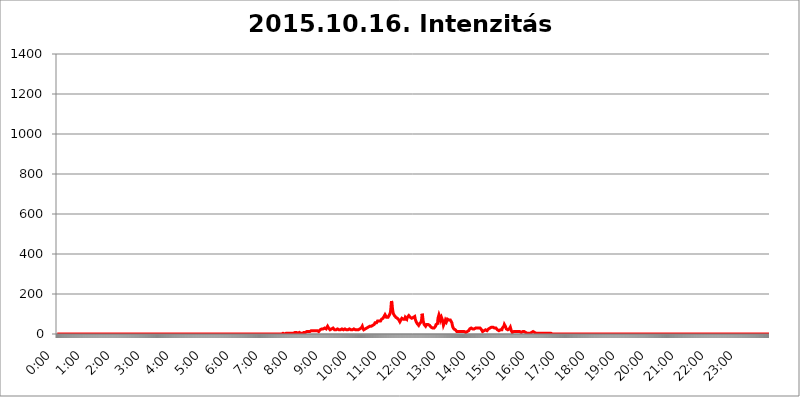
| Category | 2015.10.16. Intenzitás [W/m^2] |
|---|---|
| 0.0 | 0 |
| 0.0006944444444444445 | 0 |
| 0.001388888888888889 | 0 |
| 0.0020833333333333333 | 0 |
| 0.002777777777777778 | 0 |
| 0.003472222222222222 | 0 |
| 0.004166666666666667 | 0 |
| 0.004861111111111111 | 0 |
| 0.005555555555555556 | 0 |
| 0.0062499999999999995 | 0 |
| 0.006944444444444444 | 0 |
| 0.007638888888888889 | 0 |
| 0.008333333333333333 | 0 |
| 0.009027777777777779 | 0 |
| 0.009722222222222222 | 0 |
| 0.010416666666666666 | 0 |
| 0.011111111111111112 | 0 |
| 0.011805555555555555 | 0 |
| 0.012499999999999999 | 0 |
| 0.013194444444444444 | 0 |
| 0.013888888888888888 | 0 |
| 0.014583333333333332 | 0 |
| 0.015277777777777777 | 0 |
| 0.015972222222222224 | 0 |
| 0.016666666666666666 | 0 |
| 0.017361111111111112 | 0 |
| 0.018055555555555557 | 0 |
| 0.01875 | 0 |
| 0.019444444444444445 | 0 |
| 0.02013888888888889 | 0 |
| 0.020833333333333332 | 0 |
| 0.02152777777777778 | 0 |
| 0.022222222222222223 | 0 |
| 0.02291666666666667 | 0 |
| 0.02361111111111111 | 0 |
| 0.024305555555555556 | 0 |
| 0.024999999999999998 | 0 |
| 0.025694444444444447 | 0 |
| 0.02638888888888889 | 0 |
| 0.027083333333333334 | 0 |
| 0.027777777777777776 | 0 |
| 0.02847222222222222 | 0 |
| 0.029166666666666664 | 0 |
| 0.029861111111111113 | 0 |
| 0.030555555555555555 | 0 |
| 0.03125 | 0 |
| 0.03194444444444445 | 0 |
| 0.03263888888888889 | 0 |
| 0.03333333333333333 | 0 |
| 0.034027777777777775 | 0 |
| 0.034722222222222224 | 0 |
| 0.035416666666666666 | 0 |
| 0.036111111111111115 | 0 |
| 0.03680555555555556 | 0 |
| 0.0375 | 0 |
| 0.03819444444444444 | 0 |
| 0.03888888888888889 | 0 |
| 0.03958333333333333 | 0 |
| 0.04027777777777778 | 0 |
| 0.04097222222222222 | 0 |
| 0.041666666666666664 | 0 |
| 0.042361111111111106 | 0 |
| 0.04305555555555556 | 0 |
| 0.043750000000000004 | 0 |
| 0.044444444444444446 | 0 |
| 0.04513888888888889 | 0 |
| 0.04583333333333334 | 0 |
| 0.04652777777777778 | 0 |
| 0.04722222222222222 | 0 |
| 0.04791666666666666 | 0 |
| 0.04861111111111111 | 0 |
| 0.049305555555555554 | 0 |
| 0.049999999999999996 | 0 |
| 0.05069444444444445 | 0 |
| 0.051388888888888894 | 0 |
| 0.052083333333333336 | 0 |
| 0.05277777777777778 | 0 |
| 0.05347222222222222 | 0 |
| 0.05416666666666667 | 0 |
| 0.05486111111111111 | 0 |
| 0.05555555555555555 | 0 |
| 0.05625 | 0 |
| 0.05694444444444444 | 0 |
| 0.057638888888888885 | 0 |
| 0.05833333333333333 | 0 |
| 0.05902777777777778 | 0 |
| 0.059722222222222225 | 0 |
| 0.06041666666666667 | 0 |
| 0.061111111111111116 | 0 |
| 0.06180555555555556 | 0 |
| 0.0625 | 0 |
| 0.06319444444444444 | 0 |
| 0.06388888888888888 | 0 |
| 0.06458333333333334 | 0 |
| 0.06527777777777778 | 0 |
| 0.06597222222222222 | 0 |
| 0.06666666666666667 | 0 |
| 0.06736111111111111 | 0 |
| 0.06805555555555555 | 0 |
| 0.06874999999999999 | 0 |
| 0.06944444444444443 | 0 |
| 0.07013888888888889 | 0 |
| 0.07083333333333333 | 0 |
| 0.07152777777777779 | 0 |
| 0.07222222222222223 | 0 |
| 0.07291666666666667 | 0 |
| 0.07361111111111111 | 0 |
| 0.07430555555555556 | 0 |
| 0.075 | 0 |
| 0.07569444444444444 | 0 |
| 0.0763888888888889 | 0 |
| 0.07708333333333334 | 0 |
| 0.07777777777777778 | 0 |
| 0.07847222222222222 | 0 |
| 0.07916666666666666 | 0 |
| 0.0798611111111111 | 0 |
| 0.08055555555555556 | 0 |
| 0.08125 | 0 |
| 0.08194444444444444 | 0 |
| 0.08263888888888889 | 0 |
| 0.08333333333333333 | 0 |
| 0.08402777777777777 | 0 |
| 0.08472222222222221 | 0 |
| 0.08541666666666665 | 0 |
| 0.08611111111111112 | 0 |
| 0.08680555555555557 | 0 |
| 0.08750000000000001 | 0 |
| 0.08819444444444445 | 0 |
| 0.08888888888888889 | 0 |
| 0.08958333333333333 | 0 |
| 0.09027777777777778 | 0 |
| 0.09097222222222222 | 0 |
| 0.09166666666666667 | 0 |
| 0.09236111111111112 | 0 |
| 0.09305555555555556 | 0 |
| 0.09375 | 0 |
| 0.09444444444444444 | 0 |
| 0.09513888888888888 | 0 |
| 0.09583333333333333 | 0 |
| 0.09652777777777777 | 0 |
| 0.09722222222222222 | 0 |
| 0.09791666666666667 | 0 |
| 0.09861111111111111 | 0 |
| 0.09930555555555555 | 0 |
| 0.09999999999999999 | 0 |
| 0.10069444444444443 | 0 |
| 0.1013888888888889 | 0 |
| 0.10208333333333335 | 0 |
| 0.10277777777777779 | 0 |
| 0.10347222222222223 | 0 |
| 0.10416666666666667 | 0 |
| 0.10486111111111111 | 0 |
| 0.10555555555555556 | 0 |
| 0.10625 | 0 |
| 0.10694444444444444 | 0 |
| 0.1076388888888889 | 0 |
| 0.10833333333333334 | 0 |
| 0.10902777777777778 | 0 |
| 0.10972222222222222 | 0 |
| 0.1111111111111111 | 0 |
| 0.11180555555555556 | 0 |
| 0.11180555555555556 | 0 |
| 0.1125 | 0 |
| 0.11319444444444444 | 0 |
| 0.11388888888888889 | 0 |
| 0.11458333333333333 | 0 |
| 0.11527777777777777 | 0 |
| 0.11597222222222221 | 0 |
| 0.11666666666666665 | 0 |
| 0.1173611111111111 | 0 |
| 0.11805555555555557 | 0 |
| 0.11944444444444445 | 0 |
| 0.12013888888888889 | 0 |
| 0.12083333333333333 | 0 |
| 0.12152777777777778 | 0 |
| 0.12222222222222223 | 0 |
| 0.12291666666666667 | 0 |
| 0.12291666666666667 | 0 |
| 0.12361111111111112 | 0 |
| 0.12430555555555556 | 0 |
| 0.125 | 0 |
| 0.12569444444444444 | 0 |
| 0.12638888888888888 | 0 |
| 0.12708333333333333 | 0 |
| 0.16875 | 0 |
| 0.12847222222222224 | 0 |
| 0.12916666666666668 | 0 |
| 0.12986111111111112 | 0 |
| 0.13055555555555556 | 0 |
| 0.13125 | 0 |
| 0.13194444444444445 | 0 |
| 0.1326388888888889 | 0 |
| 0.13333333333333333 | 0 |
| 0.13402777777777777 | 0 |
| 0.13402777777777777 | 0 |
| 0.13472222222222222 | 0 |
| 0.13541666666666666 | 0 |
| 0.1361111111111111 | 0 |
| 0.13749999999999998 | 0 |
| 0.13819444444444443 | 0 |
| 0.1388888888888889 | 0 |
| 0.13958333333333334 | 0 |
| 0.14027777777777778 | 0 |
| 0.14097222222222222 | 0 |
| 0.14166666666666666 | 0 |
| 0.1423611111111111 | 0 |
| 0.14305555555555557 | 0 |
| 0.14375000000000002 | 0 |
| 0.14444444444444446 | 0 |
| 0.1451388888888889 | 0 |
| 0.1451388888888889 | 0 |
| 0.14652777777777778 | 0 |
| 0.14722222222222223 | 0 |
| 0.14791666666666667 | 0 |
| 0.1486111111111111 | 0 |
| 0.14930555555555555 | 0 |
| 0.15 | 0 |
| 0.15069444444444444 | 0 |
| 0.15138888888888888 | 0 |
| 0.15208333333333332 | 0 |
| 0.15277777777777776 | 0 |
| 0.15347222222222223 | 0 |
| 0.15416666666666667 | 0 |
| 0.15486111111111112 | 0 |
| 0.15555555555555556 | 0 |
| 0.15625 | 0 |
| 0.15694444444444444 | 0 |
| 0.15763888888888888 | 0 |
| 0.15833333333333333 | 0 |
| 0.15902777777777777 | 0 |
| 0.15972222222222224 | 0 |
| 0.16041666666666668 | 0 |
| 0.16111111111111112 | 0 |
| 0.16180555555555556 | 0 |
| 0.1625 | 0 |
| 0.16319444444444445 | 0 |
| 0.1638888888888889 | 0 |
| 0.16458333333333333 | 0 |
| 0.16527777777777777 | 0 |
| 0.16597222222222222 | 0 |
| 0.16666666666666666 | 0 |
| 0.1673611111111111 | 0 |
| 0.16805555555555554 | 0 |
| 0.16874999999999998 | 0 |
| 0.16944444444444443 | 0 |
| 0.17013888888888887 | 0 |
| 0.1708333333333333 | 0 |
| 0.17152777777777775 | 0 |
| 0.17222222222222225 | 0 |
| 0.1729166666666667 | 0 |
| 0.17361111111111113 | 0 |
| 0.17430555555555557 | 0 |
| 0.17500000000000002 | 0 |
| 0.17569444444444446 | 0 |
| 0.1763888888888889 | 0 |
| 0.17708333333333334 | 0 |
| 0.17777777777777778 | 0 |
| 0.17847222222222223 | 0 |
| 0.17916666666666667 | 0 |
| 0.1798611111111111 | 0 |
| 0.18055555555555555 | 0 |
| 0.18125 | 0 |
| 0.18194444444444444 | 0 |
| 0.1826388888888889 | 0 |
| 0.18333333333333335 | 0 |
| 0.1840277777777778 | 0 |
| 0.18472222222222223 | 0 |
| 0.18541666666666667 | 0 |
| 0.18611111111111112 | 0 |
| 0.18680555555555556 | 0 |
| 0.1875 | 0 |
| 0.18819444444444444 | 0 |
| 0.18888888888888888 | 0 |
| 0.18958333333333333 | 0 |
| 0.19027777777777777 | 0 |
| 0.1909722222222222 | 0 |
| 0.19166666666666665 | 0 |
| 0.19236111111111112 | 0 |
| 0.19305555555555554 | 0 |
| 0.19375 | 0 |
| 0.19444444444444445 | 0 |
| 0.1951388888888889 | 0 |
| 0.19583333333333333 | 0 |
| 0.19652777777777777 | 0 |
| 0.19722222222222222 | 0 |
| 0.19791666666666666 | 0 |
| 0.1986111111111111 | 0 |
| 0.19930555555555554 | 0 |
| 0.19999999999999998 | 0 |
| 0.20069444444444443 | 0 |
| 0.20138888888888887 | 0 |
| 0.2020833333333333 | 0 |
| 0.2027777777777778 | 0 |
| 0.2034722222222222 | 0 |
| 0.2041666666666667 | 0 |
| 0.20486111111111113 | 0 |
| 0.20555555555555557 | 0 |
| 0.20625000000000002 | 0 |
| 0.20694444444444446 | 0 |
| 0.2076388888888889 | 0 |
| 0.20833333333333334 | 0 |
| 0.20902777777777778 | 0 |
| 0.20972222222222223 | 0 |
| 0.21041666666666667 | 0 |
| 0.2111111111111111 | 0 |
| 0.21180555555555555 | 0 |
| 0.2125 | 0 |
| 0.21319444444444444 | 0 |
| 0.2138888888888889 | 0 |
| 0.21458333333333335 | 0 |
| 0.2152777777777778 | 0 |
| 0.21597222222222223 | 0 |
| 0.21666666666666667 | 0 |
| 0.21736111111111112 | 0 |
| 0.21805555555555556 | 0 |
| 0.21875 | 0 |
| 0.21944444444444444 | 0 |
| 0.22013888888888888 | 0 |
| 0.22083333333333333 | 0 |
| 0.22152777777777777 | 0 |
| 0.2222222222222222 | 0 |
| 0.22291666666666665 | 0 |
| 0.2236111111111111 | 0 |
| 0.22430555555555556 | 0 |
| 0.225 | 0 |
| 0.22569444444444445 | 0 |
| 0.2263888888888889 | 0 |
| 0.22708333333333333 | 0 |
| 0.22777777777777777 | 0 |
| 0.22847222222222222 | 0 |
| 0.22916666666666666 | 0 |
| 0.2298611111111111 | 0 |
| 0.23055555555555554 | 0 |
| 0.23124999999999998 | 0 |
| 0.23194444444444443 | 0 |
| 0.23263888888888887 | 0 |
| 0.2333333333333333 | 0 |
| 0.2340277777777778 | 0 |
| 0.2347222222222222 | 0 |
| 0.2354166666666667 | 0 |
| 0.23611111111111113 | 0 |
| 0.23680555555555557 | 0 |
| 0.23750000000000002 | 0 |
| 0.23819444444444446 | 0 |
| 0.2388888888888889 | 0 |
| 0.23958333333333334 | 0 |
| 0.24027777777777778 | 0 |
| 0.24097222222222223 | 0 |
| 0.24166666666666667 | 0 |
| 0.2423611111111111 | 0 |
| 0.24305555555555555 | 0 |
| 0.24375 | 0 |
| 0.24444444444444446 | 0 |
| 0.24513888888888888 | 0 |
| 0.24583333333333335 | 0 |
| 0.2465277777777778 | 0 |
| 0.24722222222222223 | 0 |
| 0.24791666666666667 | 0 |
| 0.24861111111111112 | 0 |
| 0.24930555555555556 | 0 |
| 0.25 | 0 |
| 0.25069444444444444 | 0 |
| 0.2513888888888889 | 0 |
| 0.2520833333333333 | 0 |
| 0.25277777777777777 | 0 |
| 0.2534722222222222 | 0 |
| 0.25416666666666665 | 0 |
| 0.2548611111111111 | 0 |
| 0.2555555555555556 | 0 |
| 0.25625000000000003 | 0 |
| 0.2569444444444445 | 0 |
| 0.2576388888888889 | 0 |
| 0.25833333333333336 | 0 |
| 0.2590277777777778 | 0 |
| 0.25972222222222224 | 0 |
| 0.2604166666666667 | 0 |
| 0.2611111111111111 | 0 |
| 0.26180555555555557 | 0 |
| 0.2625 | 0 |
| 0.26319444444444445 | 0 |
| 0.2638888888888889 | 0 |
| 0.26458333333333334 | 0 |
| 0.2652777777777778 | 0 |
| 0.2659722222222222 | 0 |
| 0.26666666666666666 | 0 |
| 0.2673611111111111 | 0 |
| 0.26805555555555555 | 0 |
| 0.26875 | 0 |
| 0.26944444444444443 | 0 |
| 0.2701388888888889 | 0 |
| 0.2708333333333333 | 0 |
| 0.27152777777777776 | 0 |
| 0.2722222222222222 | 0 |
| 0.27291666666666664 | 0 |
| 0.2736111111111111 | 0 |
| 0.2743055555555555 | 0 |
| 0.27499999999999997 | 0 |
| 0.27569444444444446 | 0 |
| 0.27638888888888885 | 0 |
| 0.27708333333333335 | 0 |
| 0.2777777777777778 | 0 |
| 0.27847222222222223 | 0 |
| 0.2791666666666667 | 0 |
| 0.2798611111111111 | 0 |
| 0.28055555555555556 | 0 |
| 0.28125 | 0 |
| 0.28194444444444444 | 0 |
| 0.2826388888888889 | 0 |
| 0.2833333333333333 | 0 |
| 0.28402777777777777 | 0 |
| 0.2847222222222222 | 0 |
| 0.28541666666666665 | 0 |
| 0.28611111111111115 | 0 |
| 0.28680555555555554 | 0 |
| 0.28750000000000003 | 0 |
| 0.2881944444444445 | 0 |
| 0.2888888888888889 | 0 |
| 0.28958333333333336 | 0 |
| 0.2902777777777778 | 0 |
| 0.29097222222222224 | 0 |
| 0.2916666666666667 | 0 |
| 0.2923611111111111 | 0 |
| 0.29305555555555557 | 0 |
| 0.29375 | 0 |
| 0.29444444444444445 | 0 |
| 0.2951388888888889 | 0 |
| 0.29583333333333334 | 0 |
| 0.2965277777777778 | 0 |
| 0.2972222222222222 | 0 |
| 0.29791666666666666 | 0 |
| 0.2986111111111111 | 0 |
| 0.29930555555555555 | 0 |
| 0.3 | 0 |
| 0.30069444444444443 | 0 |
| 0.3013888888888889 | 0 |
| 0.3020833333333333 | 0 |
| 0.30277777777777776 | 0 |
| 0.3034722222222222 | 0 |
| 0.30416666666666664 | 0 |
| 0.3048611111111111 | 0 |
| 0.3055555555555555 | 0 |
| 0.30624999999999997 | 0 |
| 0.3069444444444444 | 0 |
| 0.3076388888888889 | 0 |
| 0.30833333333333335 | 0 |
| 0.3090277777777778 | 0 |
| 0.30972222222222223 | 0 |
| 0.3104166666666667 | 0 |
| 0.3111111111111111 | 0 |
| 0.31180555555555556 | 0 |
| 0.3125 | 0 |
| 0.31319444444444444 | 0 |
| 0.3138888888888889 | 0 |
| 0.3145833333333333 | 0 |
| 0.31527777777777777 | 0 |
| 0.3159722222222222 | 3.525 |
| 0.31666666666666665 | 3.525 |
| 0.31736111111111115 | 0 |
| 0.31805555555555554 | 3.525 |
| 0.31875000000000003 | 0 |
| 0.3194444444444445 | 3.525 |
| 0.3201388888888889 | 3.525 |
| 0.32083333333333336 | 3.525 |
| 0.3215277777777778 | 0 |
| 0.32222222222222224 | 3.525 |
| 0.3229166666666667 | 3.525 |
| 0.3236111111111111 | 3.525 |
| 0.32430555555555557 | 3.525 |
| 0.325 | 3.525 |
| 0.32569444444444445 | 3.525 |
| 0.3263888888888889 | 3.525 |
| 0.32708333333333334 | 3.525 |
| 0.3277777777777778 | 3.525 |
| 0.3284722222222222 | 3.525 |
| 0.32916666666666666 | 3.525 |
| 0.3298611111111111 | 3.525 |
| 0.33055555555555555 | 3.525 |
| 0.33125 | 3.525 |
| 0.33194444444444443 | 3.525 |
| 0.3326388888888889 | 3.525 |
| 0.3333333333333333 | 7.887 |
| 0.3340277777777778 | 7.887 |
| 0.3347222222222222 | 7.887 |
| 0.3354166666666667 | 7.887 |
| 0.3361111111111111 | 3.525 |
| 0.3368055555555556 | 3.525 |
| 0.33749999999999997 | 3.525 |
| 0.33819444444444446 | 3.525 |
| 0.33888888888888885 | 3.525 |
| 0.33958333333333335 | 7.887 |
| 0.34027777777777773 | 7.887 |
| 0.34097222222222223 | 3.525 |
| 0.3416666666666666 | 3.525 |
| 0.3423611111111111 | 3.525 |
| 0.3430555555555555 | 3.525 |
| 0.34375 | 3.525 |
| 0.3444444444444445 | 3.525 |
| 0.3451388888888889 | 7.887 |
| 0.3458333333333334 | 7.887 |
| 0.34652777777777777 | 7.887 |
| 0.34722222222222227 | 7.887 |
| 0.34791666666666665 | 7.887 |
| 0.34861111111111115 | 7.887 |
| 0.34930555555555554 | 7.887 |
| 0.35000000000000003 | 12.257 |
| 0.3506944444444444 | 12.257 |
| 0.3513888888888889 | 12.257 |
| 0.3520833333333333 | 12.257 |
| 0.3527777777777778 | 16.636 |
| 0.3534722222222222 | 16.636 |
| 0.3541666666666667 | 12.257 |
| 0.3548611111111111 | 12.257 |
| 0.35555555555555557 | 16.636 |
| 0.35625 | 16.636 |
| 0.35694444444444445 | 16.636 |
| 0.3576388888888889 | 16.636 |
| 0.35833333333333334 | 16.636 |
| 0.3590277777777778 | 16.636 |
| 0.3597222222222222 | 16.636 |
| 0.36041666666666666 | 16.636 |
| 0.3611111111111111 | 16.636 |
| 0.36180555555555555 | 16.636 |
| 0.3625 | 16.636 |
| 0.36319444444444443 | 16.636 |
| 0.3638888888888889 | 16.636 |
| 0.3645833333333333 | 16.636 |
| 0.3652777777777778 | 12.257 |
| 0.3659722222222222 | 12.257 |
| 0.3666666666666667 | 12.257 |
| 0.3673611111111111 | 12.257 |
| 0.3680555555555556 | 12.257 |
| 0.36874999999999997 | 21.024 |
| 0.36944444444444446 | 21.024 |
| 0.37013888888888885 | 25.419 |
| 0.37083333333333335 | 25.419 |
| 0.37152777777777773 | 25.419 |
| 0.37222222222222223 | 25.419 |
| 0.3729166666666666 | 25.419 |
| 0.3736111111111111 | 29.823 |
| 0.3743055555555555 | 29.823 |
| 0.375 | 29.823 |
| 0.3756944444444445 | 29.823 |
| 0.3763888888888889 | 25.419 |
| 0.3770833333333334 | 25.419 |
| 0.37777777777777777 | 25.419 |
| 0.37847222222222227 | 29.823 |
| 0.37916666666666665 | 38.653 |
| 0.37986111111111115 | 34.234 |
| 0.38055555555555554 | 29.823 |
| 0.38125000000000003 | 25.419 |
| 0.3819444444444444 | 25.419 |
| 0.3826388888888889 | 21.024 |
| 0.3833333333333333 | 21.024 |
| 0.3840277777777778 | 21.024 |
| 0.3847222222222222 | 25.419 |
| 0.3854166666666667 | 29.823 |
| 0.3861111111111111 | 29.823 |
| 0.38680555555555557 | 29.823 |
| 0.3875 | 29.823 |
| 0.38819444444444445 | 25.419 |
| 0.3888888888888889 | 21.024 |
| 0.38958333333333334 | 21.024 |
| 0.3902777777777778 | 21.024 |
| 0.3909722222222222 | 21.024 |
| 0.39166666666666666 | 21.024 |
| 0.3923611111111111 | 21.024 |
| 0.39305555555555555 | 25.419 |
| 0.39375 | 25.419 |
| 0.39444444444444443 | 25.419 |
| 0.3951388888888889 | 21.024 |
| 0.3958333333333333 | 21.024 |
| 0.3965277777777778 | 21.024 |
| 0.3972222222222222 | 21.024 |
| 0.3979166666666667 | 21.024 |
| 0.3986111111111111 | 25.419 |
| 0.3993055555555556 | 25.419 |
| 0.39999999999999997 | 21.024 |
| 0.40069444444444446 | 21.024 |
| 0.40138888888888885 | 21.024 |
| 0.40208333333333335 | 21.024 |
| 0.40277777777777773 | 21.024 |
| 0.40347222222222223 | 25.419 |
| 0.4041666666666666 | 21.024 |
| 0.4048611111111111 | 21.024 |
| 0.4055555555555555 | 21.024 |
| 0.40625 | 21.024 |
| 0.4069444444444445 | 21.024 |
| 0.4076388888888889 | 21.024 |
| 0.4083333333333334 | 25.419 |
| 0.40902777777777777 | 25.419 |
| 0.40972222222222227 | 25.419 |
| 0.41041666666666665 | 25.419 |
| 0.41111111111111115 | 21.024 |
| 0.41180555555555554 | 21.024 |
| 0.41250000000000003 | 21.024 |
| 0.4131944444444444 | 21.024 |
| 0.4138888888888889 | 21.024 |
| 0.4145833333333333 | 21.024 |
| 0.4152777777777778 | 25.419 |
| 0.4159722222222222 | 25.419 |
| 0.4166666666666667 | 25.419 |
| 0.4173611111111111 | 21.024 |
| 0.41805555555555557 | 21.024 |
| 0.41875 | 21.024 |
| 0.41944444444444445 | 21.024 |
| 0.4201388888888889 | 21.024 |
| 0.42083333333333334 | 21.024 |
| 0.4215277777777778 | 21.024 |
| 0.4222222222222222 | 21.024 |
| 0.42291666666666666 | 21.024 |
| 0.4236111111111111 | 25.419 |
| 0.42430555555555555 | 25.419 |
| 0.425 | 25.419 |
| 0.42569444444444443 | 25.419 |
| 0.4263888888888889 | 29.823 |
| 0.4270833333333333 | 34.234 |
| 0.4277777777777778 | 38.653 |
| 0.4284722222222222 | 29.823 |
| 0.4291666666666667 | 25.419 |
| 0.4298611111111111 | 21.024 |
| 0.4305555555555556 | 21.024 |
| 0.43124999999999997 | 25.419 |
| 0.43194444444444446 | 25.419 |
| 0.43263888888888885 | 29.823 |
| 0.43333333333333335 | 29.823 |
| 0.43402777777777773 | 29.823 |
| 0.43472222222222223 | 29.823 |
| 0.4354166666666666 | 34.234 |
| 0.4361111111111111 | 34.234 |
| 0.4368055555555555 | 38.653 |
| 0.4375 | 38.653 |
| 0.4381944444444445 | 38.653 |
| 0.4388888888888889 | 38.653 |
| 0.4395833333333334 | 38.653 |
| 0.44027777777777777 | 38.653 |
| 0.44097222222222227 | 43.079 |
| 0.44166666666666665 | 43.079 |
| 0.44236111111111115 | 43.079 |
| 0.44305555555555554 | 43.079 |
| 0.44375000000000003 | 47.511 |
| 0.4444444444444444 | 47.511 |
| 0.4451388888888889 | 51.951 |
| 0.4458333333333333 | 56.398 |
| 0.4465277777777778 | 51.951 |
| 0.4472222222222222 | 56.398 |
| 0.4479166666666667 | 56.398 |
| 0.4486111111111111 | 60.85 |
| 0.44930555555555557 | 65.31 |
| 0.45 | 65.31 |
| 0.45069444444444445 | 65.31 |
| 0.4513888888888889 | 65.31 |
| 0.45208333333333334 | 65.31 |
| 0.4527777777777778 | 69.775 |
| 0.4534722222222222 | 65.31 |
| 0.45416666666666666 | 69.775 |
| 0.4548611111111111 | 74.246 |
| 0.45555555555555555 | 69.775 |
| 0.45625 | 74.246 |
| 0.45694444444444443 | 78.722 |
| 0.4576388888888889 | 83.205 |
| 0.4583333333333333 | 87.692 |
| 0.4590277777777778 | 92.184 |
| 0.4597222222222222 | 96.682 |
| 0.4604166666666667 | 96.682 |
| 0.4611111111111111 | 92.184 |
| 0.4618055555555556 | 83.205 |
| 0.46249999999999997 | 83.205 |
| 0.46319444444444446 | 78.722 |
| 0.46388888888888885 | 83.205 |
| 0.46458333333333335 | 87.692 |
| 0.46527777777777773 | 92.184 |
| 0.46597222222222223 | 96.682 |
| 0.4666666666666666 | 101.184 |
| 0.4673611111111111 | 110.201 |
| 0.4680555555555555 | 132.814 |
| 0.46875 | 164.605 |
| 0.4694444444444445 | 155.509 |
| 0.4701388888888889 | 128.284 |
| 0.4708333333333334 | 110.201 |
| 0.47152777777777777 | 101.184 |
| 0.47222222222222227 | 96.682 |
| 0.47291666666666665 | 92.184 |
| 0.47361111111111115 | 87.692 |
| 0.47430555555555554 | 92.184 |
| 0.47500000000000003 | 83.205 |
| 0.4756944444444444 | 78.722 |
| 0.4763888888888889 | 78.722 |
| 0.4770833333333333 | 78.722 |
| 0.4777777777777778 | 78.722 |
| 0.4784722222222222 | 74.246 |
| 0.4791666666666667 | 69.775 |
| 0.4798611111111111 | 65.31 |
| 0.48055555555555557 | 60.85 |
| 0.48125 | 60.85 |
| 0.48194444444444445 | 69.775 |
| 0.4826388888888889 | 74.246 |
| 0.48333333333333334 | 78.722 |
| 0.4840277777777778 | 78.722 |
| 0.4847222222222222 | 78.722 |
| 0.48541666666666666 | 74.246 |
| 0.4861111111111111 | 74.246 |
| 0.48680555555555555 | 74.246 |
| 0.4875 | 74.246 |
| 0.48819444444444443 | 83.205 |
| 0.4888888888888889 | 78.722 |
| 0.4895833333333333 | 78.722 |
| 0.4902777777777778 | 74.246 |
| 0.4909722222222222 | 83.205 |
| 0.4916666666666667 | 83.205 |
| 0.4923611111111111 | 87.692 |
| 0.4930555555555556 | 92.184 |
| 0.49374999999999997 | 92.184 |
| 0.49444444444444446 | 87.692 |
| 0.49513888888888885 | 83.205 |
| 0.49583333333333335 | 83.205 |
| 0.49652777777777773 | 78.722 |
| 0.49722222222222223 | 78.722 |
| 0.4979166666666666 | 78.722 |
| 0.4986111111111111 | 78.722 |
| 0.4993055555555555 | 83.205 |
| 0.5 | 87.692 |
| 0.5006944444444444 | 87.692 |
| 0.5013888888888889 | 87.692 |
| 0.5020833333333333 | 74.246 |
| 0.5027777777777778 | 69.775 |
| 0.5034722222222222 | 60.85 |
| 0.5041666666666667 | 60.85 |
| 0.5048611111111111 | 51.951 |
| 0.5055555555555555 | 47.511 |
| 0.50625 | 47.511 |
| 0.5069444444444444 | 43.079 |
| 0.5076388888888889 | 47.511 |
| 0.5083333333333333 | 51.951 |
| 0.5090277777777777 | 56.398 |
| 0.5097222222222222 | 56.398 |
| 0.5104166666666666 | 60.85 |
| 0.5111111111111112 | 74.246 |
| 0.5118055555555555 | 101.184 |
| 0.5125000000000001 | 87.692 |
| 0.5131944444444444 | 65.31 |
| 0.513888888888889 | 56.398 |
| 0.5145833333333333 | 47.511 |
| 0.5152777777777778 | 47.511 |
| 0.5159722222222222 | 43.079 |
| 0.5166666666666667 | 38.653 |
| 0.517361111111111 | 43.079 |
| 0.5180555555555556 | 47.511 |
| 0.5187499999999999 | 43.079 |
| 0.5194444444444445 | 47.511 |
| 0.5201388888888888 | 47.511 |
| 0.5208333333333334 | 47.511 |
| 0.5215277777777778 | 43.079 |
| 0.5222222222222223 | 43.079 |
| 0.5229166666666667 | 43.079 |
| 0.5236111111111111 | 38.653 |
| 0.5243055555555556 | 34.234 |
| 0.525 | 29.823 |
| 0.5256944444444445 | 29.823 |
| 0.5263888888888889 | 29.823 |
| 0.5270833333333333 | 29.823 |
| 0.5277777777777778 | 29.823 |
| 0.5284722222222222 | 29.823 |
| 0.5291666666666667 | 29.823 |
| 0.5298611111111111 | 34.234 |
| 0.5305555555555556 | 38.653 |
| 0.53125 | 47.511 |
| 0.5319444444444444 | 47.511 |
| 0.5326388888888889 | 47.511 |
| 0.5333333333333333 | 51.951 |
| 0.5340277777777778 | 78.722 |
| 0.5347222222222222 | 87.692 |
| 0.5354166666666667 | 96.682 |
| 0.5361111111111111 | 96.682 |
| 0.5368055555555555 | 83.205 |
| 0.5375 | 69.775 |
| 0.5381944444444444 | 74.246 |
| 0.5388888888888889 | 83.205 |
| 0.5395833333333333 | 87.692 |
| 0.5402777777777777 | 69.775 |
| 0.5409722222222222 | 56.398 |
| 0.5416666666666666 | 43.079 |
| 0.5423611111111112 | 38.653 |
| 0.5430555555555555 | 43.079 |
| 0.5437500000000001 | 60.85 |
| 0.5444444444444444 | 69.775 |
| 0.545138888888889 | 65.31 |
| 0.5458333333333333 | 60.85 |
| 0.5465277777777778 | 65.31 |
| 0.5472222222222222 | 74.246 |
| 0.5479166666666667 | 74.246 |
| 0.548611111111111 | 74.246 |
| 0.5493055555555556 | 69.775 |
| 0.5499999999999999 | 69.775 |
| 0.5506944444444445 | 69.775 |
| 0.5513888888888888 | 69.775 |
| 0.5520833333333334 | 74.246 |
| 0.5527777777777778 | 65.31 |
| 0.5534722222222223 | 56.398 |
| 0.5541666666666667 | 43.079 |
| 0.5548611111111111 | 34.234 |
| 0.5555555555555556 | 29.823 |
| 0.55625 | 25.419 |
| 0.5569444444444445 | 21.024 |
| 0.5576388888888889 | 21.024 |
| 0.5583333333333333 | 21.024 |
| 0.5590277777777778 | 16.636 |
| 0.5597222222222222 | 16.636 |
| 0.5604166666666667 | 12.257 |
| 0.5611111111111111 | 12.257 |
| 0.5618055555555556 | 12.257 |
| 0.5625 | 12.257 |
| 0.5631944444444444 | 12.257 |
| 0.5638888888888889 | 12.257 |
| 0.5645833333333333 | 12.257 |
| 0.5652777777777778 | 12.257 |
| 0.5659722222222222 | 12.257 |
| 0.5666666666666667 | 12.257 |
| 0.5673611111111111 | 7.887 |
| 0.5680555555555555 | 7.887 |
| 0.56875 | 12.257 |
| 0.5694444444444444 | 12.257 |
| 0.5701388888888889 | 12.257 |
| 0.5708333333333333 | 12.257 |
| 0.5715277777777777 | 7.887 |
| 0.5722222222222222 | 7.887 |
| 0.5729166666666666 | 7.887 |
| 0.5736111111111112 | 12.257 |
| 0.5743055555555555 | 12.257 |
| 0.5750000000000001 | 12.257 |
| 0.5756944444444444 | 12.257 |
| 0.576388888888889 | 16.636 |
| 0.5770833333333333 | 16.636 |
| 0.5777777777777778 | 21.024 |
| 0.5784722222222222 | 25.419 |
| 0.5791666666666667 | 25.419 |
| 0.579861111111111 | 29.823 |
| 0.5805555555555556 | 29.823 |
| 0.5812499999999999 | 29.823 |
| 0.5819444444444445 | 25.419 |
| 0.5826388888888888 | 25.419 |
| 0.5833333333333334 | 25.419 |
| 0.5840277777777778 | 25.419 |
| 0.5847222222222223 | 25.419 |
| 0.5854166666666667 | 25.419 |
| 0.5861111111111111 | 29.823 |
| 0.5868055555555556 | 29.823 |
| 0.5875 | 25.419 |
| 0.5881944444444445 | 25.419 |
| 0.5888888888888889 | 29.823 |
| 0.5895833333333333 | 29.823 |
| 0.5902777777777778 | 34.234 |
| 0.5909722222222222 | 29.823 |
| 0.5916666666666667 | 29.823 |
| 0.5923611111111111 | 29.823 |
| 0.5930555555555556 | 29.823 |
| 0.59375 | 29.823 |
| 0.5944444444444444 | 25.419 |
| 0.5951388888888889 | 21.024 |
| 0.5958333333333333 | 16.636 |
| 0.5965277777777778 | 12.257 |
| 0.5972222222222222 | 12.257 |
| 0.5979166666666667 | 16.636 |
| 0.5986111111111111 | 16.636 |
| 0.5993055555555555 | 16.636 |
| 0.6 | 21.024 |
| 0.6006944444444444 | 21.024 |
| 0.6013888888888889 | 21.024 |
| 0.6020833333333333 | 16.636 |
| 0.6027777777777777 | 16.636 |
| 0.6034722222222222 | 21.024 |
| 0.6041666666666666 | 21.024 |
| 0.6048611111111112 | 25.419 |
| 0.6055555555555555 | 25.419 |
| 0.6062500000000001 | 25.419 |
| 0.6069444444444444 | 29.823 |
| 0.607638888888889 | 29.823 |
| 0.6083333333333333 | 29.823 |
| 0.6090277777777778 | 34.234 |
| 0.6097222222222222 | 38.653 |
| 0.6104166666666667 | 38.653 |
| 0.611111111111111 | 34.234 |
| 0.6118055555555556 | 34.234 |
| 0.6124999999999999 | 34.234 |
| 0.6131944444444445 | 29.823 |
| 0.6138888888888888 | 25.419 |
| 0.6145833333333334 | 25.419 |
| 0.6152777777777778 | 29.823 |
| 0.6159722222222223 | 34.234 |
| 0.6166666666666667 | 29.823 |
| 0.6173611111111111 | 21.024 |
| 0.6180555555555556 | 16.636 |
| 0.61875 | 16.636 |
| 0.6194444444444445 | 16.636 |
| 0.6201388888888889 | 16.636 |
| 0.6208333333333333 | 16.636 |
| 0.6215277777777778 | 21.024 |
| 0.6222222222222222 | 21.024 |
| 0.6229166666666667 | 21.024 |
| 0.6236111111111111 | 21.024 |
| 0.6243055555555556 | 29.823 |
| 0.625 | 29.823 |
| 0.6256944444444444 | 25.419 |
| 0.6263888888888889 | 38.653 |
| 0.6270833333333333 | 47.511 |
| 0.6277777777777778 | 47.511 |
| 0.6284722222222222 | 38.653 |
| 0.6291666666666667 | 34.234 |
| 0.6298611111111111 | 25.419 |
| 0.6305555555555555 | 21.024 |
| 0.63125 | 21.024 |
| 0.6319444444444444 | 21.024 |
| 0.6326388888888889 | 16.636 |
| 0.6333333333333333 | 16.636 |
| 0.6340277777777777 | 25.419 |
| 0.6347222222222222 | 29.823 |
| 0.6354166666666666 | 34.234 |
| 0.6361111111111112 | 29.823 |
| 0.6368055555555555 | 16.636 |
| 0.6375000000000001 | 12.257 |
| 0.6381944444444444 | 7.887 |
| 0.638888888888889 | 7.887 |
| 0.6395833333333333 | 12.257 |
| 0.6402777777777778 | 12.257 |
| 0.6409722222222222 | 12.257 |
| 0.6416666666666667 | 12.257 |
| 0.642361111111111 | 12.257 |
| 0.6430555555555556 | 12.257 |
| 0.6437499999999999 | 12.257 |
| 0.6444444444444445 | 12.257 |
| 0.6451388888888888 | 12.257 |
| 0.6458333333333334 | 12.257 |
| 0.6465277777777778 | 12.257 |
| 0.6472222222222223 | 12.257 |
| 0.6479166666666667 | 12.257 |
| 0.6486111111111111 | 12.257 |
| 0.6493055555555556 | 7.887 |
| 0.65 | 7.887 |
| 0.6506944444444445 | 7.887 |
| 0.6513888888888889 | 7.887 |
| 0.6520833333333333 | 12.257 |
| 0.6527777777777778 | 12.257 |
| 0.6534722222222222 | 12.257 |
| 0.6541666666666667 | 12.257 |
| 0.6548611111111111 | 12.257 |
| 0.6555555555555556 | 12.257 |
| 0.65625 | 7.887 |
| 0.6569444444444444 | 7.887 |
| 0.6576388888888889 | 3.525 |
| 0.6583333333333333 | 3.525 |
| 0.6590277777777778 | 3.525 |
| 0.6597222222222222 | 3.525 |
| 0.6604166666666667 | 3.525 |
| 0.6611111111111111 | 3.525 |
| 0.6618055555555555 | 3.525 |
| 0.6625 | 3.525 |
| 0.6631944444444444 | 3.525 |
| 0.6638888888888889 | 3.525 |
| 0.6645833333333333 | 7.887 |
| 0.6652777777777777 | 7.887 |
| 0.6659722222222222 | 12.257 |
| 0.6666666666666666 | 12.257 |
| 0.6673611111111111 | 12.257 |
| 0.6680555555555556 | 12.257 |
| 0.6687500000000001 | 7.887 |
| 0.6694444444444444 | 7.887 |
| 0.6701388888888888 | 3.525 |
| 0.6708333333333334 | 3.525 |
| 0.6715277777777778 | 3.525 |
| 0.6722222222222222 | 7.887 |
| 0.6729166666666666 | 3.525 |
| 0.6736111111111112 | 3.525 |
| 0.6743055555555556 | 0 |
| 0.6749999999999999 | 3.525 |
| 0.6756944444444444 | 3.525 |
| 0.6763888888888889 | 3.525 |
| 0.6770833333333334 | 3.525 |
| 0.6777777777777777 | 3.525 |
| 0.6784722222222223 | 3.525 |
| 0.6791666666666667 | 3.525 |
| 0.6798611111111111 | 3.525 |
| 0.6805555555555555 | 3.525 |
| 0.68125 | 3.525 |
| 0.6819444444444445 | 3.525 |
| 0.6826388888888889 | 3.525 |
| 0.6833333333333332 | 3.525 |
| 0.6840277777777778 | 3.525 |
| 0.6847222222222222 | 3.525 |
| 0.6854166666666667 | 3.525 |
| 0.686111111111111 | 3.525 |
| 0.6868055555555556 | 3.525 |
| 0.6875 | 3.525 |
| 0.6881944444444444 | 3.525 |
| 0.688888888888889 | 3.525 |
| 0.6895833333333333 | 3.525 |
| 0.6902777777777778 | 3.525 |
| 0.6909722222222222 | 0 |
| 0.6916666666666668 | 0 |
| 0.6923611111111111 | 3.525 |
| 0.6930555555555555 | 3.525 |
| 0.69375 | 3.525 |
| 0.6944444444444445 | 0 |
| 0.6951388888888889 | 3.525 |
| 0.6958333333333333 | 0 |
| 0.6965277777777777 | 0 |
| 0.6972222222222223 | 0 |
| 0.6979166666666666 | 0 |
| 0.6986111111111111 | 0 |
| 0.6993055555555556 | 0 |
| 0.7000000000000001 | 0 |
| 0.7006944444444444 | 0 |
| 0.7013888888888888 | 0 |
| 0.7020833333333334 | 0 |
| 0.7027777777777778 | 0 |
| 0.7034722222222222 | 0 |
| 0.7041666666666666 | 0 |
| 0.7048611111111112 | 0 |
| 0.7055555555555556 | 0 |
| 0.7062499999999999 | 0 |
| 0.7069444444444444 | 0 |
| 0.7076388888888889 | 0 |
| 0.7083333333333334 | 0 |
| 0.7090277777777777 | 0 |
| 0.7097222222222223 | 0 |
| 0.7104166666666667 | 0 |
| 0.7111111111111111 | 0 |
| 0.7118055555555555 | 0 |
| 0.7125 | 0 |
| 0.7131944444444445 | 0 |
| 0.7138888888888889 | 0 |
| 0.7145833333333332 | 0 |
| 0.7152777777777778 | 0 |
| 0.7159722222222222 | 0 |
| 0.7166666666666667 | 0 |
| 0.717361111111111 | 0 |
| 0.7180555555555556 | 0 |
| 0.71875 | 0 |
| 0.7194444444444444 | 0 |
| 0.720138888888889 | 0 |
| 0.7208333333333333 | 0 |
| 0.7215277777777778 | 0 |
| 0.7222222222222222 | 0 |
| 0.7229166666666668 | 0 |
| 0.7236111111111111 | 0 |
| 0.7243055555555555 | 0 |
| 0.725 | 0 |
| 0.7256944444444445 | 0 |
| 0.7263888888888889 | 0 |
| 0.7270833333333333 | 0 |
| 0.7277777777777777 | 0 |
| 0.7284722222222223 | 0 |
| 0.7291666666666666 | 0 |
| 0.7298611111111111 | 0 |
| 0.7305555555555556 | 0 |
| 0.7312500000000001 | 0 |
| 0.7319444444444444 | 0 |
| 0.7326388888888888 | 0 |
| 0.7333333333333334 | 0 |
| 0.7340277777777778 | 0 |
| 0.7347222222222222 | 0 |
| 0.7354166666666666 | 0 |
| 0.7361111111111112 | 0 |
| 0.7368055555555556 | 0 |
| 0.7374999999999999 | 0 |
| 0.7381944444444444 | 0 |
| 0.7388888888888889 | 0 |
| 0.7395833333333334 | 0 |
| 0.7402777777777777 | 0 |
| 0.7409722222222223 | 0 |
| 0.7416666666666667 | 0 |
| 0.7423611111111111 | 0 |
| 0.7430555555555555 | 0 |
| 0.74375 | 0 |
| 0.7444444444444445 | 0 |
| 0.7451388888888889 | 0 |
| 0.7458333333333332 | 0 |
| 0.7465277777777778 | 0 |
| 0.7472222222222222 | 0 |
| 0.7479166666666667 | 0 |
| 0.748611111111111 | 0 |
| 0.7493055555555556 | 0 |
| 0.75 | 0 |
| 0.7506944444444444 | 0 |
| 0.751388888888889 | 0 |
| 0.7520833333333333 | 0 |
| 0.7527777777777778 | 0 |
| 0.7534722222222222 | 0 |
| 0.7541666666666668 | 0 |
| 0.7548611111111111 | 0 |
| 0.7555555555555555 | 0 |
| 0.75625 | 0 |
| 0.7569444444444445 | 0 |
| 0.7576388888888889 | 0 |
| 0.7583333333333333 | 0 |
| 0.7590277777777777 | 0 |
| 0.7597222222222223 | 0 |
| 0.7604166666666666 | 0 |
| 0.7611111111111111 | 0 |
| 0.7618055555555556 | 0 |
| 0.7625000000000001 | 0 |
| 0.7631944444444444 | 0 |
| 0.7638888888888888 | 0 |
| 0.7645833333333334 | 0 |
| 0.7652777777777778 | 0 |
| 0.7659722222222222 | 0 |
| 0.7666666666666666 | 0 |
| 0.7673611111111112 | 0 |
| 0.7680555555555556 | 0 |
| 0.7687499999999999 | 0 |
| 0.7694444444444444 | 0 |
| 0.7701388888888889 | 0 |
| 0.7708333333333334 | 0 |
| 0.7715277777777777 | 0 |
| 0.7722222222222223 | 0 |
| 0.7729166666666667 | 0 |
| 0.7736111111111111 | 0 |
| 0.7743055555555555 | 0 |
| 0.775 | 0 |
| 0.7756944444444445 | 0 |
| 0.7763888888888889 | 0 |
| 0.7770833333333332 | 0 |
| 0.7777777777777778 | 0 |
| 0.7784722222222222 | 0 |
| 0.7791666666666667 | 0 |
| 0.779861111111111 | 0 |
| 0.7805555555555556 | 0 |
| 0.78125 | 0 |
| 0.7819444444444444 | 0 |
| 0.782638888888889 | 0 |
| 0.7833333333333333 | 0 |
| 0.7840277777777778 | 0 |
| 0.7847222222222222 | 0 |
| 0.7854166666666668 | 0 |
| 0.7861111111111111 | 0 |
| 0.7868055555555555 | 0 |
| 0.7875 | 0 |
| 0.7881944444444445 | 0 |
| 0.7888888888888889 | 0 |
| 0.7895833333333333 | 0 |
| 0.7902777777777777 | 0 |
| 0.7909722222222223 | 0 |
| 0.7916666666666666 | 0 |
| 0.7923611111111111 | 0 |
| 0.7930555555555556 | 0 |
| 0.7937500000000001 | 0 |
| 0.7944444444444444 | 0 |
| 0.7951388888888888 | 0 |
| 0.7958333333333334 | 0 |
| 0.7965277777777778 | 0 |
| 0.7972222222222222 | 0 |
| 0.7979166666666666 | 0 |
| 0.7986111111111112 | 0 |
| 0.7993055555555556 | 0 |
| 0.7999999999999999 | 0 |
| 0.8006944444444444 | 0 |
| 0.8013888888888889 | 0 |
| 0.8020833333333334 | 0 |
| 0.8027777777777777 | 0 |
| 0.8034722222222223 | 0 |
| 0.8041666666666667 | 0 |
| 0.8048611111111111 | 0 |
| 0.8055555555555555 | 0 |
| 0.80625 | 0 |
| 0.8069444444444445 | 0 |
| 0.8076388888888889 | 0 |
| 0.8083333333333332 | 0 |
| 0.8090277777777778 | 0 |
| 0.8097222222222222 | 0 |
| 0.8104166666666667 | 0 |
| 0.811111111111111 | 0 |
| 0.8118055555555556 | 0 |
| 0.8125 | 0 |
| 0.8131944444444444 | 0 |
| 0.813888888888889 | 0 |
| 0.8145833333333333 | 0 |
| 0.8152777777777778 | 0 |
| 0.8159722222222222 | 0 |
| 0.8166666666666668 | 0 |
| 0.8173611111111111 | 0 |
| 0.8180555555555555 | 0 |
| 0.81875 | 0 |
| 0.8194444444444445 | 0 |
| 0.8201388888888889 | 0 |
| 0.8208333333333333 | 0 |
| 0.8215277777777777 | 0 |
| 0.8222222222222223 | 0 |
| 0.8229166666666666 | 0 |
| 0.8236111111111111 | 0 |
| 0.8243055555555556 | 0 |
| 0.8250000000000001 | 0 |
| 0.8256944444444444 | 0 |
| 0.8263888888888888 | 0 |
| 0.8270833333333334 | 0 |
| 0.8277777777777778 | 0 |
| 0.8284722222222222 | 0 |
| 0.8291666666666666 | 0 |
| 0.8298611111111112 | 0 |
| 0.8305555555555556 | 0 |
| 0.8312499999999999 | 0 |
| 0.8319444444444444 | 0 |
| 0.8326388888888889 | 0 |
| 0.8333333333333334 | 0 |
| 0.8340277777777777 | 0 |
| 0.8347222222222223 | 0 |
| 0.8354166666666667 | 0 |
| 0.8361111111111111 | 0 |
| 0.8368055555555555 | 0 |
| 0.8375 | 0 |
| 0.8381944444444445 | 0 |
| 0.8388888888888889 | 0 |
| 0.8395833333333332 | 0 |
| 0.8402777777777778 | 0 |
| 0.8409722222222222 | 0 |
| 0.8416666666666667 | 0 |
| 0.842361111111111 | 0 |
| 0.8430555555555556 | 0 |
| 0.84375 | 0 |
| 0.8444444444444444 | 0 |
| 0.845138888888889 | 0 |
| 0.8458333333333333 | 0 |
| 0.8465277777777778 | 0 |
| 0.8472222222222222 | 0 |
| 0.8479166666666668 | 0 |
| 0.8486111111111111 | 0 |
| 0.8493055555555555 | 0 |
| 0.85 | 0 |
| 0.8506944444444445 | 0 |
| 0.8513888888888889 | 0 |
| 0.8520833333333333 | 0 |
| 0.8527777777777777 | 0 |
| 0.8534722222222223 | 0 |
| 0.8541666666666666 | 0 |
| 0.8548611111111111 | 0 |
| 0.8555555555555556 | 0 |
| 0.8562500000000001 | 0 |
| 0.8569444444444444 | 0 |
| 0.8576388888888888 | 0 |
| 0.8583333333333334 | 0 |
| 0.8590277777777778 | 0 |
| 0.8597222222222222 | 0 |
| 0.8604166666666666 | 0 |
| 0.8611111111111112 | 0 |
| 0.8618055555555556 | 0 |
| 0.8624999999999999 | 0 |
| 0.8631944444444444 | 0 |
| 0.8638888888888889 | 0 |
| 0.8645833333333334 | 0 |
| 0.8652777777777777 | 0 |
| 0.8659722222222223 | 0 |
| 0.8666666666666667 | 0 |
| 0.8673611111111111 | 0 |
| 0.8680555555555555 | 0 |
| 0.86875 | 0 |
| 0.8694444444444445 | 0 |
| 0.8701388888888889 | 0 |
| 0.8708333333333332 | 0 |
| 0.8715277777777778 | 0 |
| 0.8722222222222222 | 0 |
| 0.8729166666666667 | 0 |
| 0.873611111111111 | 0 |
| 0.8743055555555556 | 0 |
| 0.875 | 0 |
| 0.8756944444444444 | 0 |
| 0.876388888888889 | 0 |
| 0.8770833333333333 | 0 |
| 0.8777777777777778 | 0 |
| 0.8784722222222222 | 0 |
| 0.8791666666666668 | 0 |
| 0.8798611111111111 | 0 |
| 0.8805555555555555 | 0 |
| 0.88125 | 0 |
| 0.8819444444444445 | 0 |
| 0.8826388888888889 | 0 |
| 0.8833333333333333 | 0 |
| 0.8840277777777777 | 0 |
| 0.8847222222222223 | 0 |
| 0.8854166666666666 | 0 |
| 0.8861111111111111 | 0 |
| 0.8868055555555556 | 0 |
| 0.8875000000000001 | 0 |
| 0.8881944444444444 | 0 |
| 0.8888888888888888 | 0 |
| 0.8895833333333334 | 0 |
| 0.8902777777777778 | 0 |
| 0.8909722222222222 | 0 |
| 0.8916666666666666 | 0 |
| 0.8923611111111112 | 0 |
| 0.8930555555555556 | 0 |
| 0.8937499999999999 | 0 |
| 0.8944444444444444 | 0 |
| 0.8951388888888889 | 0 |
| 0.8958333333333334 | 0 |
| 0.8965277777777777 | 0 |
| 0.8972222222222223 | 0 |
| 0.8979166666666667 | 0 |
| 0.8986111111111111 | 0 |
| 0.8993055555555555 | 0 |
| 0.9 | 0 |
| 0.9006944444444445 | 0 |
| 0.9013888888888889 | 0 |
| 0.9020833333333332 | 0 |
| 0.9027777777777778 | 0 |
| 0.9034722222222222 | 0 |
| 0.9041666666666667 | 0 |
| 0.904861111111111 | 0 |
| 0.9055555555555556 | 0 |
| 0.90625 | 0 |
| 0.9069444444444444 | 0 |
| 0.907638888888889 | 0 |
| 0.9083333333333333 | 0 |
| 0.9090277777777778 | 0 |
| 0.9097222222222222 | 0 |
| 0.9104166666666668 | 0 |
| 0.9111111111111111 | 0 |
| 0.9118055555555555 | 0 |
| 0.9125 | 0 |
| 0.9131944444444445 | 0 |
| 0.9138888888888889 | 0 |
| 0.9145833333333333 | 0 |
| 0.9152777777777777 | 0 |
| 0.9159722222222223 | 0 |
| 0.9166666666666666 | 0 |
| 0.9173611111111111 | 0 |
| 0.9180555555555556 | 0 |
| 0.9187500000000001 | 0 |
| 0.9194444444444444 | 0 |
| 0.9201388888888888 | 0 |
| 0.9208333333333334 | 0 |
| 0.9215277777777778 | 0 |
| 0.9222222222222222 | 0 |
| 0.9229166666666666 | 0 |
| 0.9236111111111112 | 0 |
| 0.9243055555555556 | 0 |
| 0.9249999999999999 | 0 |
| 0.9256944444444444 | 0 |
| 0.9263888888888889 | 0 |
| 0.9270833333333334 | 0 |
| 0.9277777777777777 | 0 |
| 0.9284722222222223 | 0 |
| 0.9291666666666667 | 0 |
| 0.9298611111111111 | 0 |
| 0.9305555555555555 | 0 |
| 0.93125 | 0 |
| 0.9319444444444445 | 0 |
| 0.9326388888888889 | 0 |
| 0.9333333333333332 | 0 |
| 0.9340277777777778 | 0 |
| 0.9347222222222222 | 0 |
| 0.9354166666666667 | 0 |
| 0.936111111111111 | 0 |
| 0.9368055555555556 | 0 |
| 0.9375 | 0 |
| 0.9381944444444444 | 0 |
| 0.938888888888889 | 0 |
| 0.9395833333333333 | 0 |
| 0.9402777777777778 | 0 |
| 0.9409722222222222 | 0 |
| 0.9416666666666668 | 0 |
| 0.9423611111111111 | 0 |
| 0.9430555555555555 | 0 |
| 0.94375 | 0 |
| 0.9444444444444445 | 0 |
| 0.9451388888888889 | 0 |
| 0.9458333333333333 | 0 |
| 0.9465277777777777 | 0 |
| 0.9472222222222223 | 0 |
| 0.9479166666666666 | 0 |
| 0.9486111111111111 | 0 |
| 0.9493055555555556 | 0 |
| 0.9500000000000001 | 0 |
| 0.9506944444444444 | 0 |
| 0.9513888888888888 | 0 |
| 0.9520833333333334 | 0 |
| 0.9527777777777778 | 0 |
| 0.9534722222222222 | 0 |
| 0.9541666666666666 | 0 |
| 0.9548611111111112 | 0 |
| 0.9555555555555556 | 0 |
| 0.9562499999999999 | 0 |
| 0.9569444444444444 | 0 |
| 0.9576388888888889 | 0 |
| 0.9583333333333334 | 0 |
| 0.9590277777777777 | 0 |
| 0.9597222222222223 | 0 |
| 0.9604166666666667 | 0 |
| 0.9611111111111111 | 0 |
| 0.9618055555555555 | 0 |
| 0.9625 | 0 |
| 0.9631944444444445 | 0 |
| 0.9638888888888889 | 0 |
| 0.9645833333333332 | 0 |
| 0.9652777777777778 | 0 |
| 0.9659722222222222 | 0 |
| 0.9666666666666667 | 0 |
| 0.967361111111111 | 0 |
| 0.9680555555555556 | 0 |
| 0.96875 | 0 |
| 0.9694444444444444 | 0 |
| 0.970138888888889 | 0 |
| 0.9708333333333333 | 0 |
| 0.9715277777777778 | 0 |
| 0.9722222222222222 | 0 |
| 0.9729166666666668 | 0 |
| 0.9736111111111111 | 0 |
| 0.9743055555555555 | 0 |
| 0.975 | 0 |
| 0.9756944444444445 | 0 |
| 0.9763888888888889 | 0 |
| 0.9770833333333333 | 0 |
| 0.9777777777777777 | 0 |
| 0.9784722222222223 | 0 |
| 0.9791666666666666 | 0 |
| 0.9798611111111111 | 0 |
| 0.9805555555555556 | 0 |
| 0.9812500000000001 | 0 |
| 0.9819444444444444 | 0 |
| 0.9826388888888888 | 0 |
| 0.9833333333333334 | 0 |
| 0.9840277777777778 | 0 |
| 0.9847222222222222 | 0 |
| 0.9854166666666666 | 0 |
| 0.9861111111111112 | 0 |
| 0.9868055555555556 | 0 |
| 0.9874999999999999 | 0 |
| 0.9881944444444444 | 0 |
| 0.9888888888888889 | 0 |
| 0.9895833333333334 | 0 |
| 0.9902777777777777 | 0 |
| 0.9909722222222223 | 0 |
| 0.9916666666666667 | 0 |
| 0.9923611111111111 | 0 |
| 0.9930555555555555 | 0 |
| 0.99375 | 0 |
| 0.9944444444444445 | 0 |
| 0.9951388888888889 | 0 |
| 0.9958333333333332 | 0 |
| 0.9965277777777778 | 0 |
| 0.9972222222222222 | 0 |
| 0.9979166666666667 | 0 |
| 0.998611111111111 | 0 |
| 0.9993055555555556 | 0 |